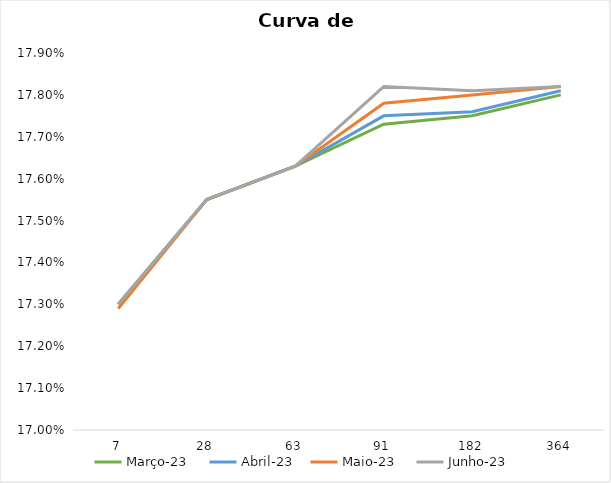
| Category | Março-23  | Abril-23 | Maio-23  | Junho-23  |
|---|---|---|---|---|
| 7.0 | 0.173 | 0.173 | 0.173 | 0.173 |
| 28.0 | 0.176 | 0.176 | 0.176 | 0.176 |
| 63.0 | 0.176 | 0.176 | 0.176 | 0.176 |
| 91.0 | 0.177 | 0.178 | 0.178 | 0.178 |
| 182.0 | 0.178 | 0.178 | 0.178 | 0.178 |
| 364.0 | 0.178 | 0.178 | 0.178 | 0.178 |